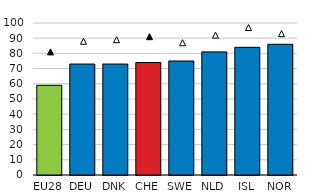
| Category | All |
|---|---|
| EU28 | 59 |
| DEU | 73 |
| DNK | 73 |
| CHE | 74 |
| SWE | 75 |
| NLD | 81 |
| ISL | 84 |
| NOR | 86 |